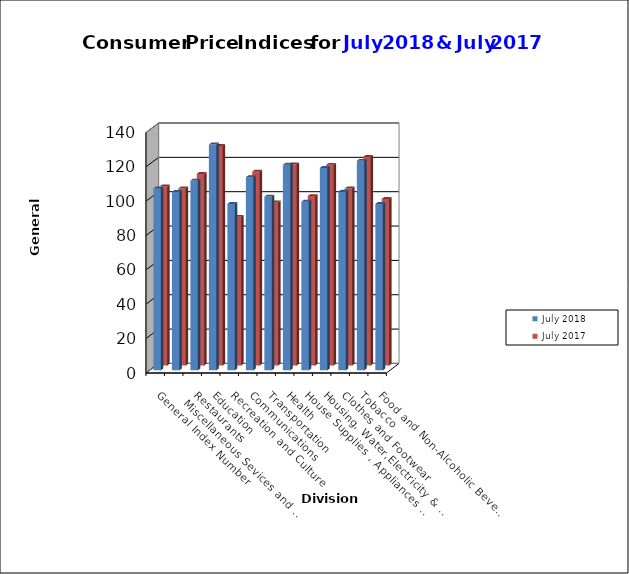
| Category |                  July 2018 |                   July 2017 |
|---|---|---|
| Food and Non-Alcoholic Beverages | 96.9 | 97 |
| Tobacco | 122 | 121.5 |
| Clothes and Footwear | 104 | 103.1 |
| Housing, Water,Electricity & LPG  | 117.9 | 116.9 |
| House Supplies , Appliances & Maintenance | 98.2 | 98.7 |
| Health | 119.7 | 117.2 |
| Transportation | 101.2 | 95 |
| Communications | 112.5 | 112.9 |
| Recreation and Culture | 96.9 | 86.6 |
| Education | 131.5 | 127.9 |
| Restaurants | 110.5 | 111.6 |
|    Miscellaneous Sevices and Goods | 103.9 | 103.1 |
| General Index Number | 105.9 | 104.3 |